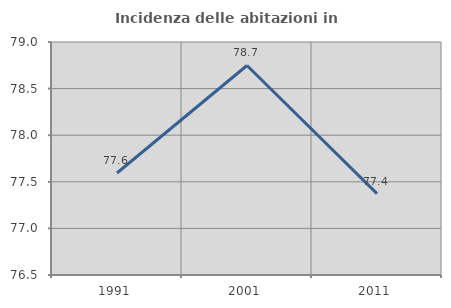
| Category | Incidenza delle abitazioni in proprietà  |
|---|---|
| 1991.0 | 77.594 |
| 2001.0 | 78.748 |
| 2011.0 | 77.373 |